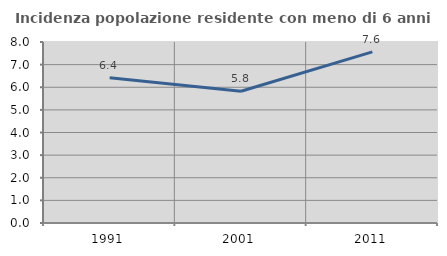
| Category | Incidenza popolazione residente con meno di 6 anni |
|---|---|
| 1991.0 | 6.425 |
| 2001.0 | 5.824 |
| 2011.0 | 7.565 |